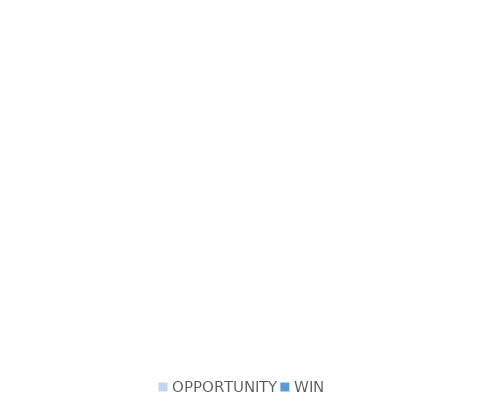
| Category | Series 0 |
|---|---|
| OPPORTUNITY | 0 |
| WIN | 0 |